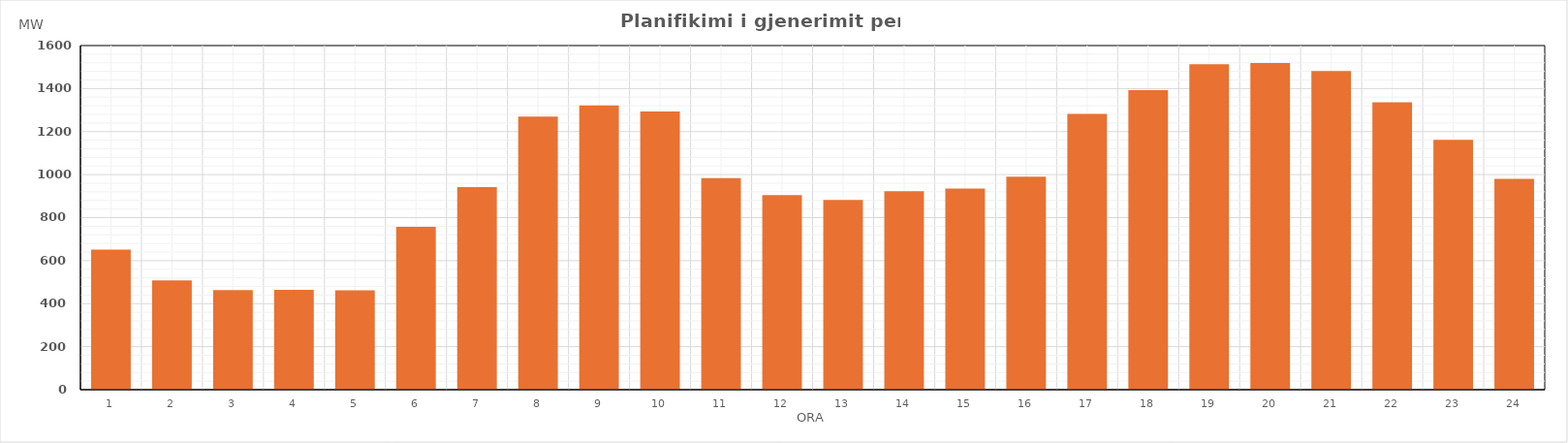
| Category | Max (MW) |
|---|---|
| 0 | 651.68 |
| 1 | 507.78 |
| 2 | 462.56 |
| 3 | 463.96 |
| 4 | 461.55 |
| 5 | 757.66 |
| 6 | 942.03 |
| 7 | 1270.31 |
| 8 | 1322.18 |
| 9 | 1293.86 |
| 10 | 983.1 |
| 11 | 904.25 |
| 12 | 882.57 |
| 13 | 923.26 |
| 14 | 934.89 |
| 15 | 990.98 |
| 16 | 1282.75 |
| 17 | 1392.15 |
| 18 | 1513.16 |
| 19 | 1518.39 |
| 20 | 1481.83 |
| 21 | 1336.28 |
| 22 | 1161.28 |
| 23 | 980.67 |